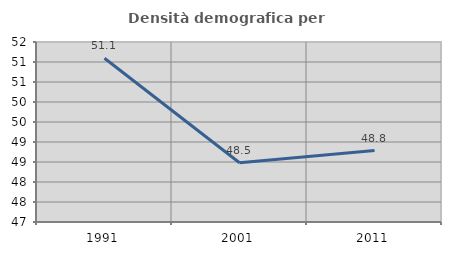
| Category | Densità demografica |
|---|---|
| 1991.0 | 51.094 |
| 2001.0 | 48.482 |
| 2011.0 | 48.786 |